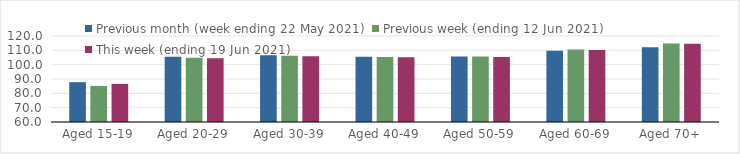
| Category | Previous month (week ending 22 May 2021) | Previous week (ending 12 Jun 2021) | This week (ending 19 Jun 2021) |
|---|---|---|---|
| Aged 15-19 | 87.79 | 85.17 | 86.56 |
| Aged 20-29 | 105.57 | 104.81 | 104.47 |
| Aged 30-39 | 106.58 | 106.3 | 105.83 |
| Aged 40-49 | 105.58 | 105.37 | 105.18 |
| Aged 50-59 | 105.76 | 105.69 | 105.41 |
| Aged 60-69 | 109.69 | 110.52 | 110.24 |
| Aged 70+ | 112.09 | 114.84 | 114.59 |